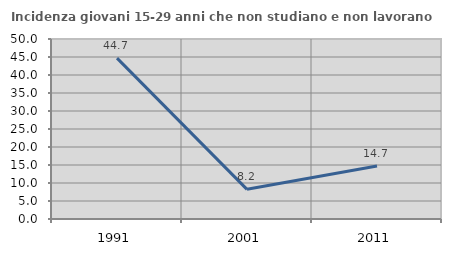
| Category | Incidenza giovani 15-29 anni che non studiano e non lavorano  |
|---|---|
| 1991.0 | 44.681 |
| 2001.0 | 8.238 |
| 2011.0 | 14.721 |